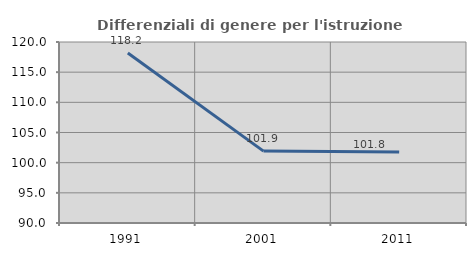
| Category | Differenziali di genere per l'istruzione superiore |
|---|---|
| 1991.0 | 118.167 |
| 2001.0 | 101.915 |
| 2011.0 | 101.777 |